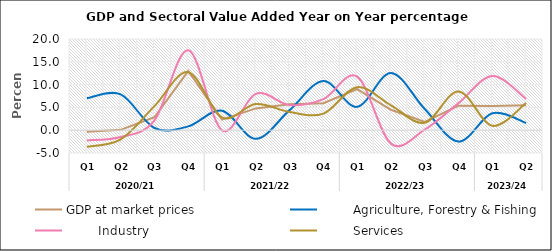
| Category | GDP at market prices |         Agriculture, Forestry & Fishing |         Industry |         Services |
|---|---|---|---|---|
| 0 | -0.36 | 7.037 | -2.233 | -3.638 |
| 1 | 0.076 | 7.865 | -1.484 | -2.01 |
| 2 | 2.837 | 0.479 | 2.153 | 5.274 |
| 3 | 12.995 | 0.836 | 17.541 | 12.727 |
| 4 | 2.313 | 4.286 | -0.035 | 2.794 |
| 5 | 4.783 | -1.885 | 7.977 | 5.741 |
| 6 | 5.67 | 4.402 | 5.54 | 3.989 |
| 7 | 5.913 | 10.791 | 6.82 | 3.644 |
| 8 | 9.027 | 5.119 | 11.74 | 9.435 |
| 9 | 4.472 | 12.546 | -2.951 | 5.465 |
| 10 | 1.813 | 4.64 | 0.125 | 1.639 |
| 11 | 5.378 | -2.505 | 5.942 | 8.508 |
| 12 | 5.305 | 3.701 | 11.879 | 0.952 |
| 13 | 5.472 | 1.565 | 6.835 | 5.967 |